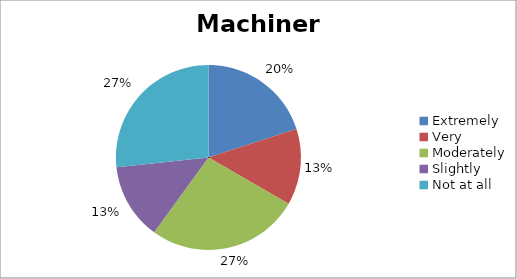
| Category | Machinery |
|---|---|
| Extremely | 3 |
| Very | 2 |
| Moderately | 4 |
| Slightly | 2 |
| Not at all | 4 |